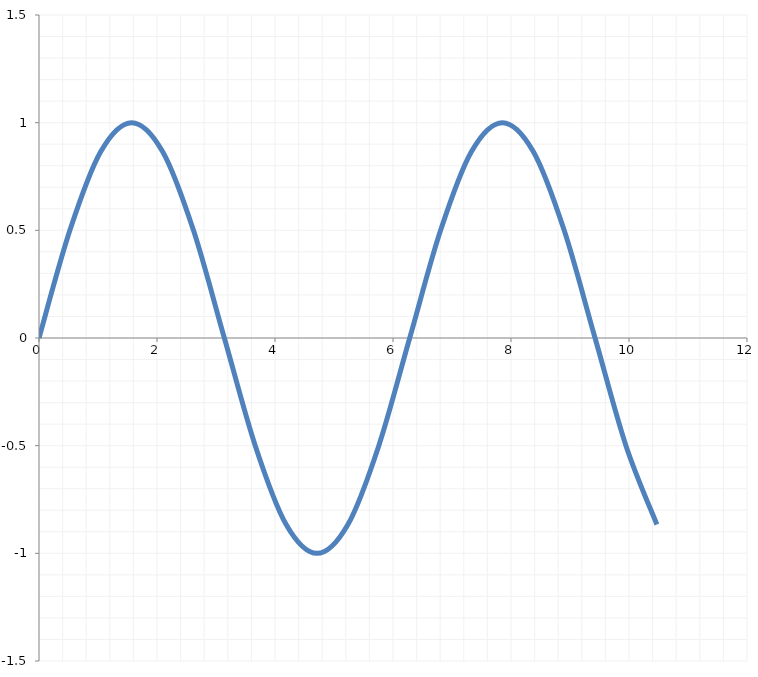
| Category | Series 0 |
|---|---|
| 0.0 | 0 |
| 0.5235987755982988 | 0.5 |
| 1.0471975511965976 | 0.866 |
| 1.5707963267948966 | 1 |
| 2.0943951023931953 | 0.866 |
| 2.617993877991494 | 0.5 |
| 3.1415926535897927 | 0 |
| 3.6651914291880914 | -0.5 |
| 4.1887902047863905 | -0.866 |
| 4.71238898038469 | -1 |
| 5.235987755982989 | -0.866 |
| 5.759586531581288 | -0.5 |
| 6.283185307179587 | 0 |
| 6.806784082777886 | 0.5 |
| 7.330382858376185 | 0.866 |
| 7.853981633974485 | 1 |
| 8.377580409572783 | 0.866 |
| 8.901179185171081 | 0.5 |
| 9.42477796076938 | 0 |
| 9.948376736367678 | -0.5 |
| 10.471975511965976 | -0.866 |